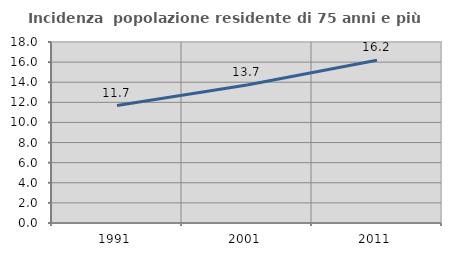
| Category | Incidenza  popolazione residente di 75 anni e più |
|---|---|
| 1991.0 | 11.675 |
| 2001.0 | 13.72 |
| 2011.0 | 16.185 |